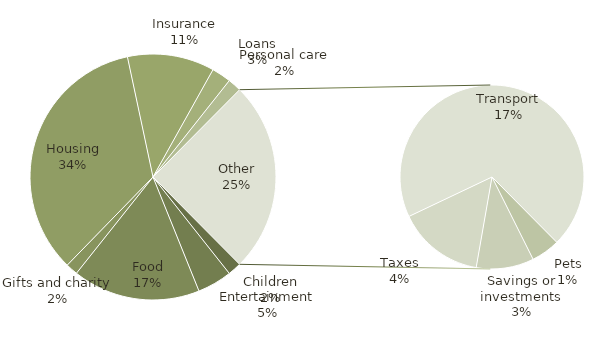
| Category | Total |
|---|---|
| Children | 140 |
| Entertainment | 358 |
| Food | 1320 |
| Gifts and charity | 125 |
| Housing | 2702 |
| Insurance | 900 |
| Loans | 200 |
| Personal care | 140 |
| Pets | 100 |
| Savings or investments | 200 |
| Taxes | 300 |
| Transport | 1375 |